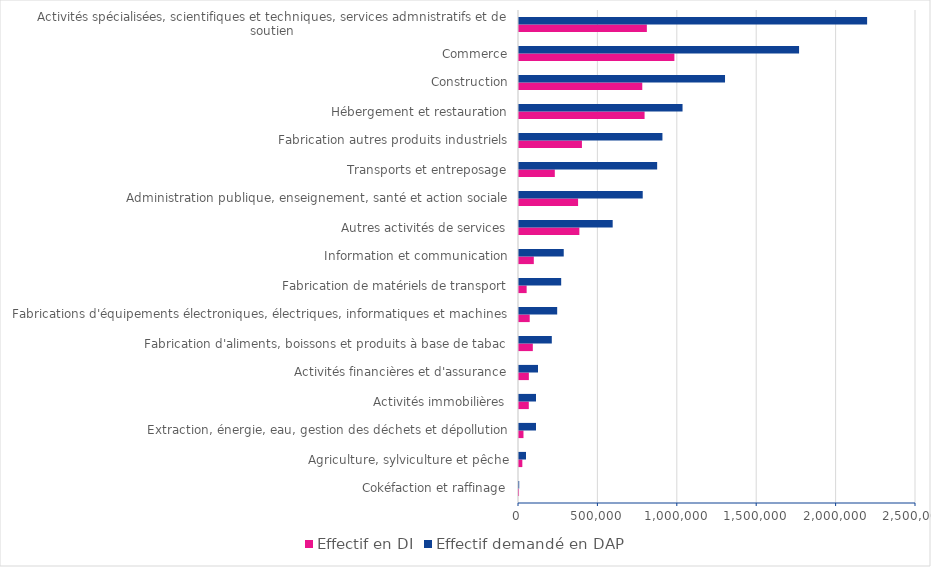
| Category | Effectif en DI | Effectif demandé en DAP |
|---|---|---|
| Cokéfaction et raffinage | 163 | 1366 |
| Agriculture, sylviculture et pêche | 20948 | 43912 |
| Extraction, énergie, eau, gestion des déchets et dépollution | 28220 | 107012 |
| Activités immobilières | 61732 | 107024 |
| Activités financières et d'assurance | 62064 | 119532 |
| Fabrication d'aliments, boissons et produits à base de tabac | 87031 | 206562 |
| Fabrications d'équipements électroniques, électriques, informatiques et machines | 67514 | 240432 |
| Fabrication de matériels de transport | 48148 | 265651 |
| Information et communication | 93265 | 281704 |
| Autres activités de services | 380153 | 589933 |
| Administration publique, enseignement, santé et action sociale | 372010 | 779133 |
| Transports et entreposage | 225506 | 870019 |
| Fabrication autres produits industriels | 396327 | 903241 |
| Hébergement et restauration | 790860 | 1029880 |
| Construction | 776292 | 1297366 |
| Commerce | 978608 | 1763683 |
| Activités spécialisées, scientifiques et techniques, services admnistratifs et de soutien | 805157 | 2192149 |